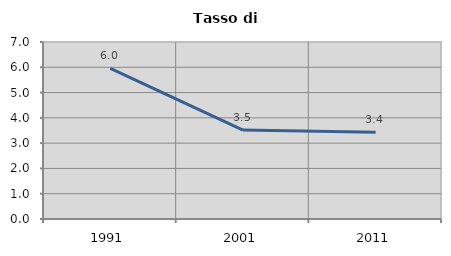
| Category | Tasso di disoccupazione   |
|---|---|
| 1991.0 | 5.957 |
| 2001.0 | 3.516 |
| 2011.0 | 3.429 |